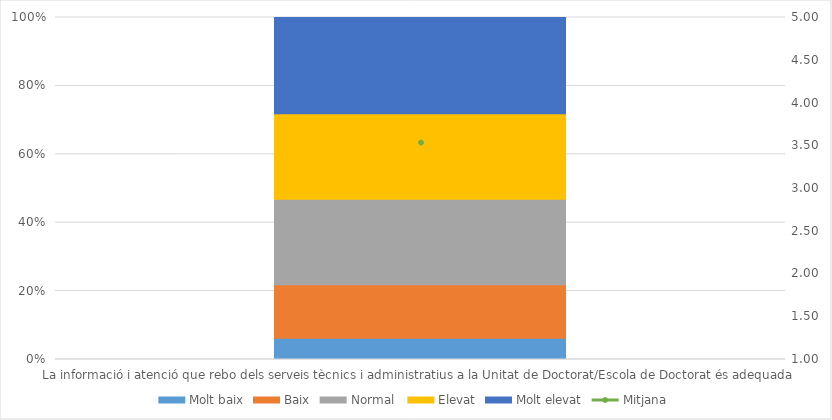
| Category | Molt baix | Baix | Normal  | Elevat | Molt elevat |
|---|---|---|---|---|---|
| La informació i atenció que rebo dels serveis tècnics i administratius a la Unitat de Doctorat/Escola de Doctorat és adequada | 2 | 5 | 8 | 8 | 9 |